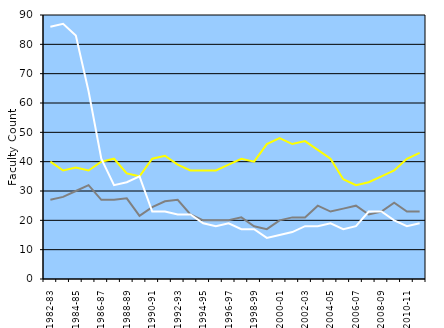
| Category | Simon Graduate School of Business | Warner Graduate School of Education | School of Nursing |
|---|---|---|---|
| 1982-83 | 40 | 27 | 86 |
| 1983-84 | 37 | 28 | 87 |
| 1984-85 | 38 | 30 | 83 |
| 1985-86 | 37 | 32 | 64 |
| 1986-87 | 40 | 27 | 41 |
| 1987-88 | 41 | 27 | 32 |
| 1988-89 | 36 | 27.5 | 33 |
| 1989-90 | 35 | 21.5 | 35 |
| 1990-91 | 41 | 24.5 | 23 |
| 1991-92 | 42 | 26.5 | 23 |
| 1992-93 | 39 | 27 | 22 |
| 1993-94 | 37 | 22 | 22 |
| 1994-95 | 37 | 20 | 19 |
| 1995-96 | 37 | 20 | 18 |
| 1996-97 | 39 | 20 | 19 |
| 1997-98 | 41 | 21 | 17 |
| 1998-99 | 40 | 18 | 17 |
| 1999-00 | 46 | 17 | 14 |
| 2000-01 | 48 | 20 | 15 |
| 2001-02 | 46 | 21 | 16 |
| 2002-03 | 47 | 21 | 18 |
| 2003-04 | 44 | 25 | 18 |
| 2004-05 | 41 | 23 | 19 |
| 2005-06 | 34 | 24 | 17 |
| 2006-07 | 32 | 25 | 18 |
| 2007-08 | 33 | 22 | 23 |
| 2008-09 | 35 | 23 | 23 |
| 2009-10 | 37 | 26 | 20 |
| 2010-11 | 41 | 23 | 18 |
| 2011-12 | 43 | 23 | 19 |